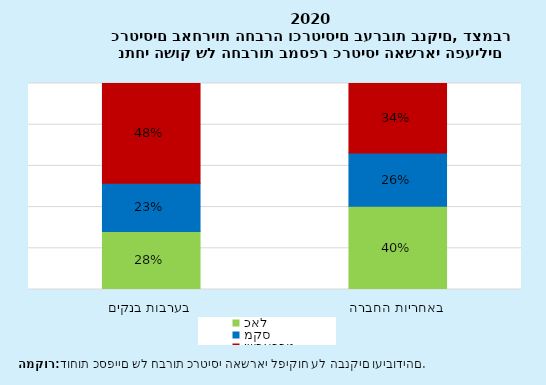
| Category | כאל | מקס | ישראכרט |
|---|---|---|---|
| בערבות בנקים | 0.282 | 0.234 | 0.484 |
| באחריות החברה | 0.404 | 0.258 | 0.338 |